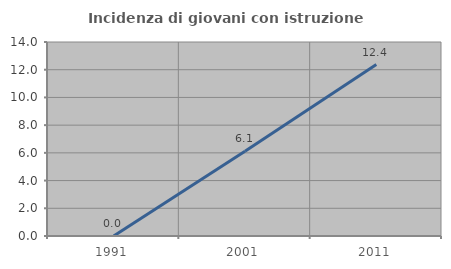
| Category | Incidenza di giovani con istruzione universitaria |
|---|---|
| 1991.0 | 0 |
| 2001.0 | 6.122 |
| 2011.0 | 12.376 |